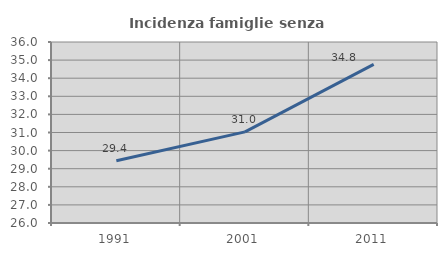
| Category | Incidenza famiglie senza nuclei |
|---|---|
| 1991.0 | 29.442 |
| 2001.0 | 31.034 |
| 2011.0 | 34.763 |